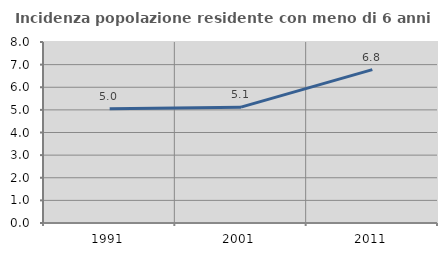
| Category | Incidenza popolazione residente con meno di 6 anni |
|---|---|
| 1991.0 | 5.046 |
| 2001.0 | 5.119 |
| 2011.0 | 6.778 |